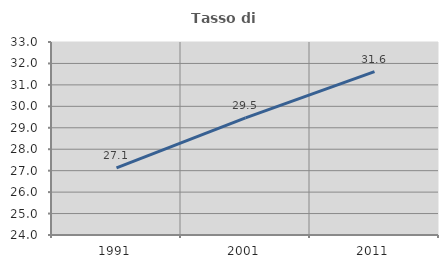
| Category | Tasso di occupazione   |
|---|---|
| 1991.0 | 27.133 |
| 2001.0 | 29.465 |
| 2011.0 | 31.621 |